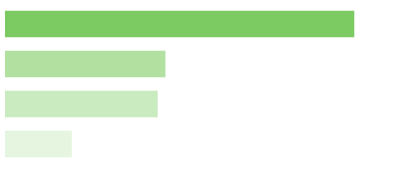
| Category | Series 0 |
|---|---|
| 0 | 0 |
| 1 | 42500 |
| 2 | 98000 |
| 3 | 103000 |
| 4 | 225000 |